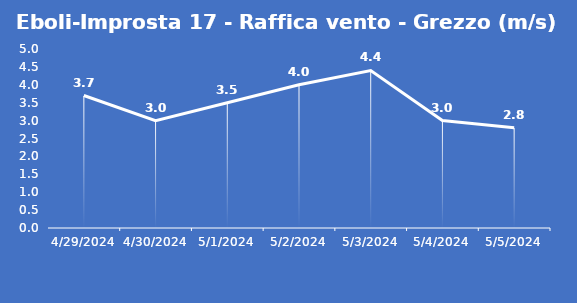
| Category | Eboli-Improsta 17 - Raffica vento - Grezzo (m/s) |
|---|---|
| 4/29/24 | 3.7 |
| 4/30/24 | 3 |
| 5/1/24 | 3.5 |
| 5/2/24 | 4 |
| 5/3/24 | 4.4 |
| 5/4/24 | 3 |
| 5/5/24 | 2.8 |